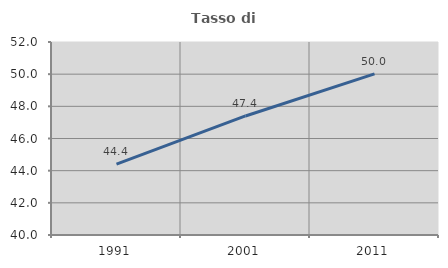
| Category | Tasso di occupazione   |
|---|---|
| 1991.0 | 44.408 |
| 2001.0 | 47.401 |
| 2011.0 | 50.021 |